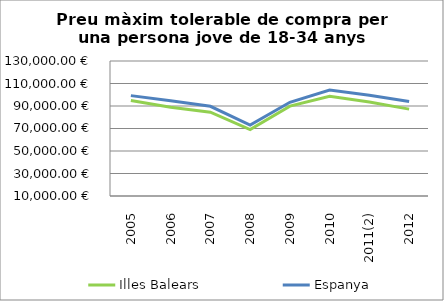
| Category | Illes Balears | Espanya |
|---|---|---|
| 2005 | 94889.06 | 99216 |
| 2006 | 88918.87 | 94573.49 |
| 2007 | 84545.25 | 89728 |
| 2008 | 69001.91 | 72980.53 |
| 2009 | 89922.1 | 93292.83 |
| 2010 | 98556.93 | 104255.67 |
| 2011(2) | 93469.687 | 99579.163 |
| 2012 | 87232.17 | 93913.94 |